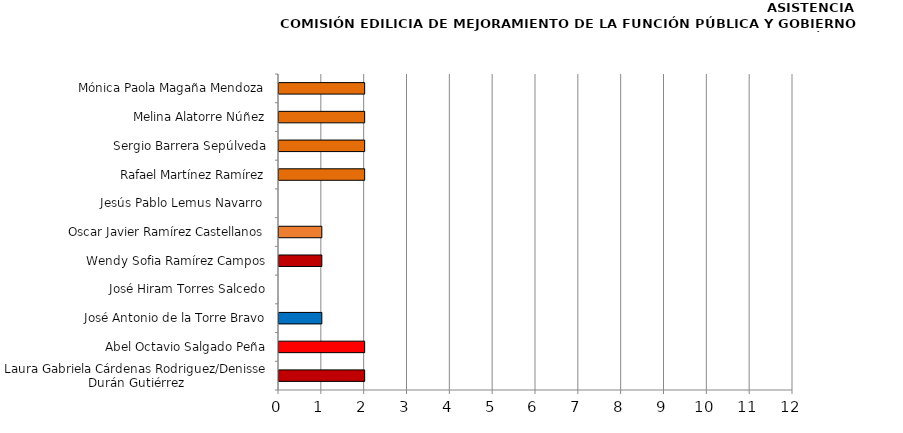
| Category | Series 0 |
|---|---|
| Laura Gabriela Cárdenas Rodriguez/Denisse Durán Gutiérrez | 2 |
| Abel Octavio Salgado Peña | 2 |
| José Antonio de la Torre Bravo | 1 |
| José Hiram Torres Salcedo | 0 |
| Wendy Sofia Ramírez Campos | 1 |
| Oscar Javier Ramírez Castellanos | 1 |
| Jesús Pablo Lemus Navarro  | 0 |
| Rafael Martínez Ramírez | 2 |
| Sergio Barrera Sepúlveda | 2 |
| Melina Alatorre Núñez | 2 |
| Mónica Paola Magaña Mendoza | 2 |